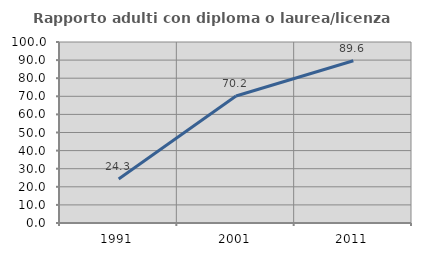
| Category | Rapporto adulti con diploma o laurea/licenza media  |
|---|---|
| 1991.0 | 24.345 |
| 2001.0 | 70.153 |
| 2011.0 | 89.608 |